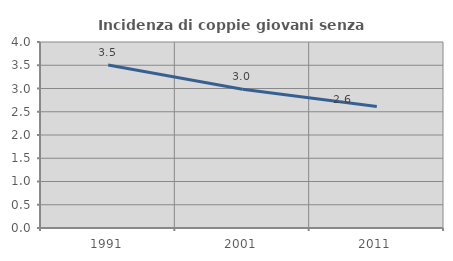
| Category | Incidenza di coppie giovani senza figli |
|---|---|
| 1991.0 | 3.504 |
| 2001.0 | 2.985 |
| 2011.0 | 2.611 |